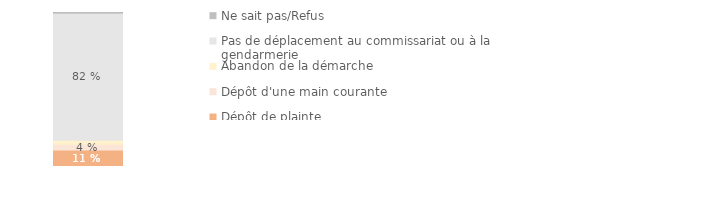
| Category | Dépôt de plainte | Dépôt d'une main courante | Abandon de la démarche | Pas de déplacement au commissariat ou à la gendarmerie | Ne sait pas/Refus |
|---|---|---|---|---|---|
|  | 0.107 | 0.038 | 0.026 | 0.825 | 0.004 |